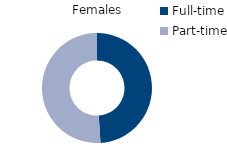
| Category | Females |
|---|---|
| Full-time | 49 |
| Part-time | 51 |